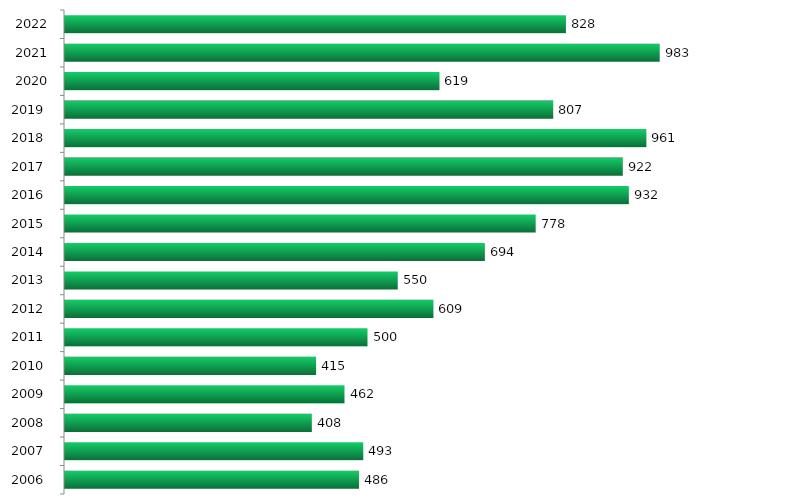
| Category | Series 0 |
|---|---|
| 2006.0 | 486 |
| 2007.0 | 493 |
| 2008.0 | 408 |
| 2009.0 | 462 |
| 2010.0 | 415 |
| 2011.0 | 500 |
| 2012.0 | 609 |
| 2013.0 | 550 |
| 2014.0 | 694 |
| 2015.0 | 778 |
| 2016.0 | 932 |
| 2017.0 | 922 |
| 2018.0 | 961 |
| 2019.0 | 807 |
| 2020.0 | 619 |
| 2021.0 | 983 |
| 2022.0 | 828 |